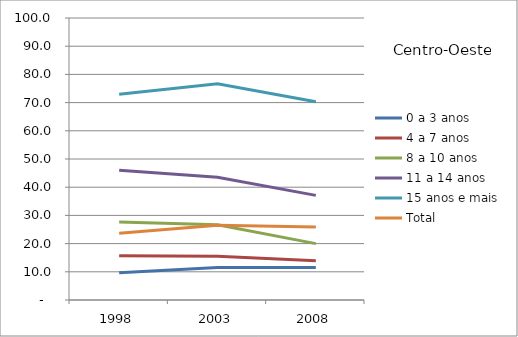
| Category | 0 a 3 anos | 4 a 7 anos | 8 a 10 anos | 11 a 14 anos | 15 anos e mais | Total |
|---|---|---|---|---|---|---|
| 1998.0 | 9.7 | 15.7 | 27.7 | 46 | 73 | 23.7 |
| 2003.0 | 11.5 | 15.5 | 26.7 | 43.5 | 76.7 | 26.5 |
| 2008.0 | 11.5 | 13.9 | 20 | 37.1 | 70.3 | 25.9 |